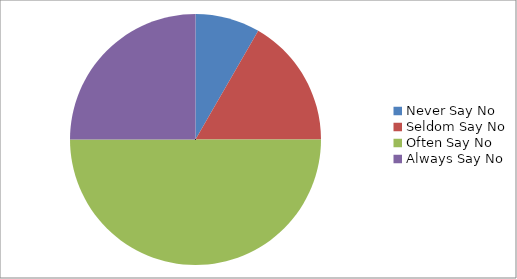
| Category | Series 0 |
|---|---|
| Never Say No | 1 |
| Seldom Say No | 2 |
| Often Say No | 6 |
| Always Say No | 3 |